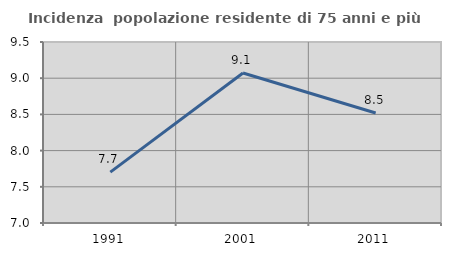
| Category | Incidenza  popolazione residente di 75 anni e più |
|---|---|
| 1991.0 | 7.703 |
| 2001.0 | 9.072 |
| 2011.0 | 8.519 |